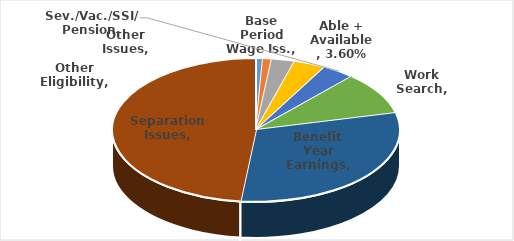
| Category | Series 0 |
|---|---|
| Base Period Wage Iss. | 0.008 |
| Other Issues | 0.01 |
| Other Eligibility | 0.026 |
| Able + Available | 0.036 |
| Sev./Vac./SSI/ Pension | 0.036 |
| Work Search | 0.096 |
| Benefit Year Earnings | 0.305 |
| Separation Issues | 0.483 |